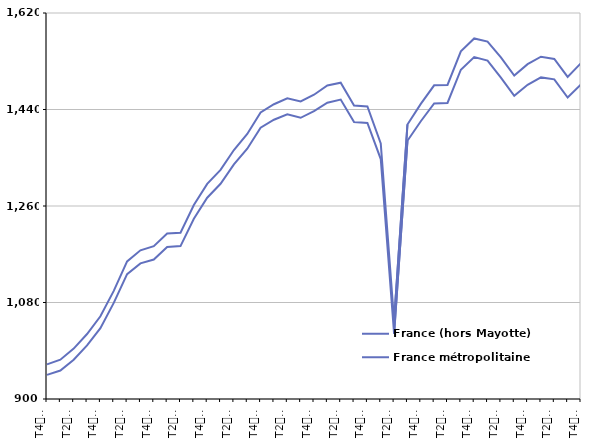
| Category | France (hors Mayotte) | France métropolitaine |
|---|---|---|
| T4
2013 | 964.6 | 945 |
| T1
2014 | 973.4 | 953.1 |
| T2
2014 | 994 | 973.3 |
| T3
2014 | 1021.2 | 1000 |
| T4
2014 | 1054.2 | 1032.2 |
| T1
2015 | 1101.7 | 1079.3 |
| T2
2015 | 1156.6 | 1132.9 |
| T3
2015 | 1177.4 | 1153 |
| T4
2015 | 1185 | 1160.1 |
| T1
2016 | 1208.7 | 1183.5 |
| T2
2016 | 1210.1 | 1185.2 |
| T3
2016 | 1261.7 | 1236.2 |
| T4
2016 | 1301.2 | 1275.5 |
| T1
2017 | 1327.3 | 1301.4 |
| T2
2017 | 1364.4 | 1337.7 |
| T3
2017 | 1394.3 | 1366.8 |
| T4
2017 | 1434.4 | 1406 |
| T1
2018 | 1449.8 | 1420.9 |
| T2
2018 | 1461 | 1431 |
| T3
2018 | 1455 | 1424.5 |
| T4
2018 | 1467.6 | 1436.9 |
| T1
2019 | 1484.8 | 1452.7 |
| T2
2019 | 1489.9 | 1458.5 |
| T3
2019 | 1447.4 | 1416.5 |
| T4
2019 | 1445.7 | 1414.9 |
| T1
2020 | 1376.6 | 1347.6 |
| T2
2020 | 1045.6 | 1022 |
| T3
2020 | 1412.1 | 1381.7 |
| T4
2020 | 1450.4 | 1418.1 |
| T1
2021 | 1485.1 | 1451.3 |
| T2
2021 | 1485.8 | 1452.2 |
| T3
2021 | 1548.4 | 1514.2 |
| T4
2021 | 1572.5 | 1537.8 |
| T1
2022 | 1566.6 | 1531.3 |
| T2
2022 | 1537.1 | 1499.6 |
| T3
2022 | 1503.3 | 1465.5 |
| T4
2022 | 1524.5 | 1486 |
| T1
2023 | 1538.5 | 1499.9 |
| T2
2023 | 1534.3 | 1496.3 |
| T3
2023 | 1500.8 | 1462.3 |
| T4
2023 | 1526.5 | 1486.8 |